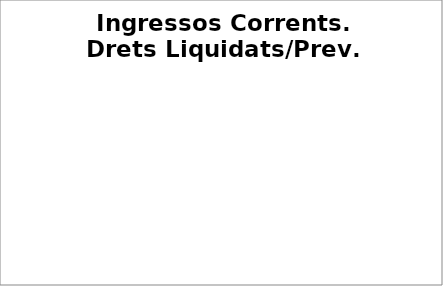
| Category | Series 0 |
|---|---|
| Impostos locals | 0.569 |
| Participació Tributs de l'Estat | 0.484 |
| Taxes i altres ingressos | 0.41 |
| Transferències corrents (exc. FCF) | 0.497 |
| Ingressos patrimonials | 0.329 |
| Ingressos corrents | 0.508 |